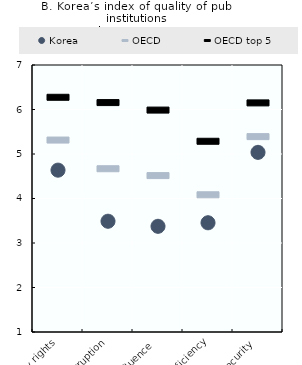
| Category | Korea | OECD | OECD top 5 |
|---|---|---|---|
| Property rights | 4.637 | 5.313 | 6.274 |
| Ethics and corruption | 3.489 | 4.669 | 6.156 |
| Undue influence | 3.375 | 4.515 | 5.987 |
| Government efficiency | 3.455 | 4.083 | 5.286 |
| Security | 5.037 | 5.39 | 6.148 |